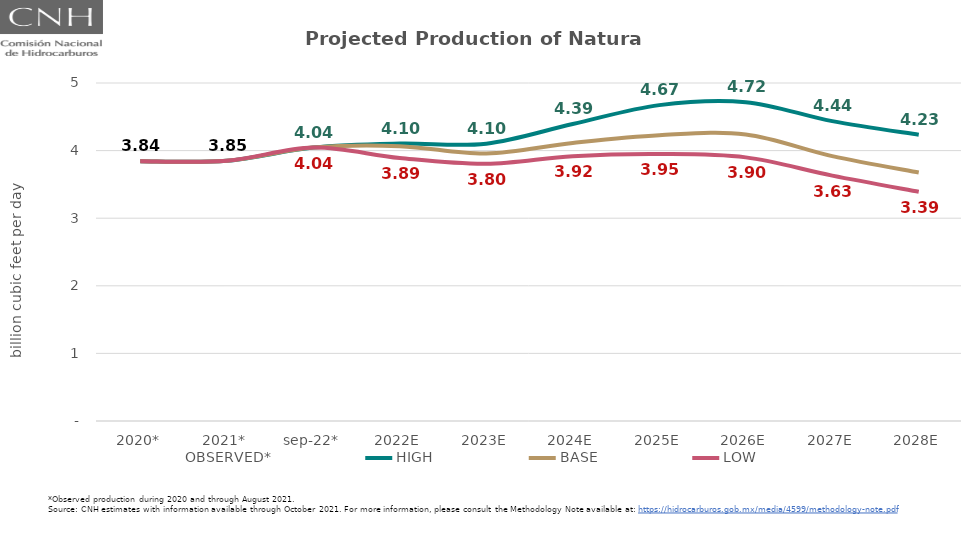
| Category | OBSERVED* | HIGH | BASE | LOW |
|---|---|---|---|---|
| 2020* | 3.843 | 3.843 | 3.843 | 3.843 |
| 2021* | 3.849 | 3.849 | 3.849 | 3.849 |
| sep-22* | 4.045 | 4.045 | 4.045 | 4.045 |
| 2022E | 4.066 | 4.103 | 4.066 | 3.89 |
| 2023E | 3.956 | 4.103 | 3.956 | 3.804 |
| 2024E | 4.113 | 4.393 | 4.113 | 3.918 |
| 2025E | 4.227 | 4.673 | 4.227 | 3.949 |
| 2026E | 4.239 | 4.717 | 4.239 | 3.9 |
| 2027E | 3.919 | 4.436 | 3.919 | 3.63 |
| 2028E | 3.675 | 4.234 | 3.675 | 3.392 |